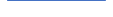
| Category | Series 0 |
|---|---|
| 0 | 9 |
| 1 | 3 |
| 2 | 3 |
| 3 | 8 |
| 4 | 5 |
| 5 | 6 |
| 6 | 4 |
| 7 | 4 |
| 8 | 2 |